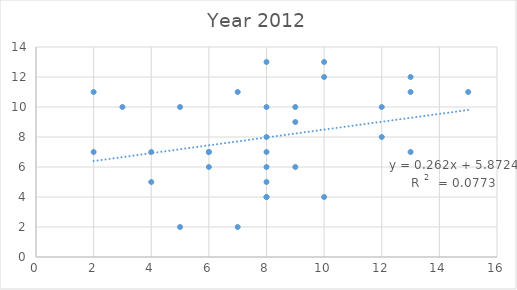
| Category | Year 2012 |
|---|---|
| 10.0 | 13 |
| 8.0 | 13 |
| 13.0 | 12 |
| 10.0 | 12 |
| 15.0 | 11 |
| 13.0 | 11 |
| 7.0 | 11 |
| 2.0 | 11 |
| 5.0 | 10 |
| 8.0 | 10 |
| 3.0 | 10 |
| 12.0 | 10 |
| 9.0 | 10 |
| 9.0 | 9 |
| 8.0 | 8 |
| 12.0 | 8 |
| 13.0 | 7 |
| 6.0 | 7 |
| 4.0 | 7 |
| 2.0 | 7 |
| 6.0 | 7 |
| 8.0 | 7 |
| 8.0 | 6 |
| 6.0 | 6 |
| 9.0 | 6 |
| 8.0 | 5 |
| 4.0 | 5 |
| 8.0 | 4 |
| 10.0 | 4 |
| 8.0 | 4 |
| 5.0 | 2 |
| 7.0 | 2 |